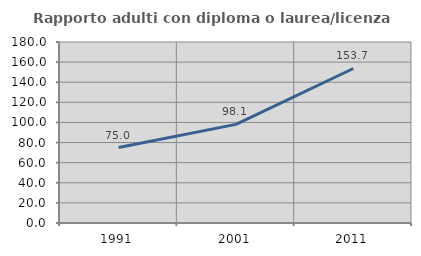
| Category | Rapporto adulti con diploma o laurea/licenza media  |
|---|---|
| 1991.0 | 75 |
| 2001.0 | 98.077 |
| 2011.0 | 153.659 |